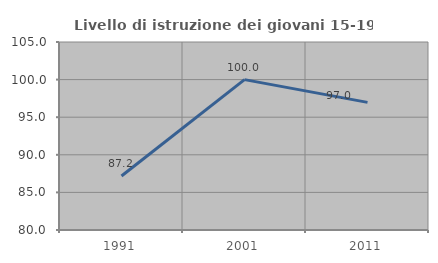
| Category | Livello di istruzione dei giovani 15-19 anni |
|---|---|
| 1991.0 | 87.179 |
| 2001.0 | 100 |
| 2011.0 | 96.97 |